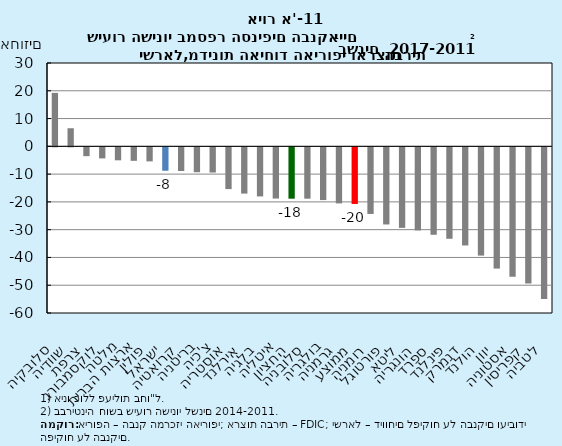
| Category | Series 0 |
|---|---|
| סלובקיה | 19.246 |
| שוודיה | 6.516 |
| צרפת | -3.185 |
| לוקסמבורג | -3.982 |
| מלטה | -4.673 |
| ארצות הברית | -4.856 |
| פולין | -5.051 |
| ישראל | -8.426 |
| קרואטיה | -8.511 |
| בריטניה | -8.968 |
| צ'כיה | -9.078 |
| אוסטריה | -15.03 |
| אירלנד | -16.652 |
| בלגיה | -17.676 |
| איטליה | -18.435 |
| החציון | -18.486 |
| סלובניה | -18.486 |
| בולגריה | -18.983 |
| גרמניה | -20.18 |
| ממוצע | -20.388 |
| רומניה | -23.983 |
| פורטוגל | -27.765 |
| ליטא | -28.994 |
| הונגריה | -29.922 |
| ספרד | -31.476 |
| פינלנד | -32.918 |
| דנמרק | -35.324 |
| הולנד | -38.975 |
| יוון | -43.644 |
| אסטוניה | -46.629 |
| קפריסין | -49.002 |
| לטביה | -54.645 |